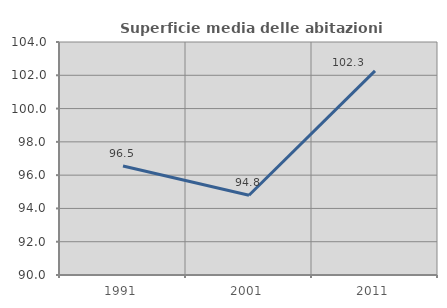
| Category | Superficie media delle abitazioni occupate |
|---|---|
| 1991.0 | 96.545 |
| 2001.0 | 94.789 |
| 2011.0 | 102.269 |